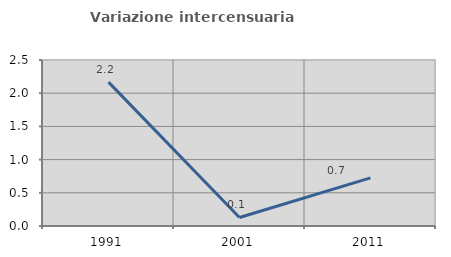
| Category | Variazione intercensuaria annua |
|---|---|
| 1991.0 | 2.167 |
| 2001.0 | 0.128 |
| 2011.0 | 0.724 |